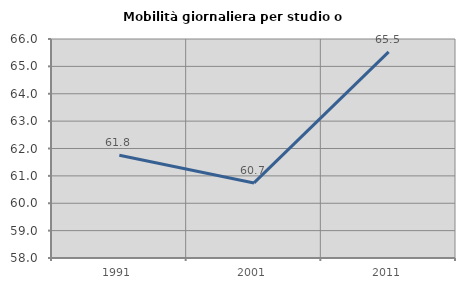
| Category | Mobilità giornaliera per studio o lavoro |
|---|---|
| 1991.0 | 61.754 |
| 2001.0 | 60.742 |
| 2011.0 | 65.527 |